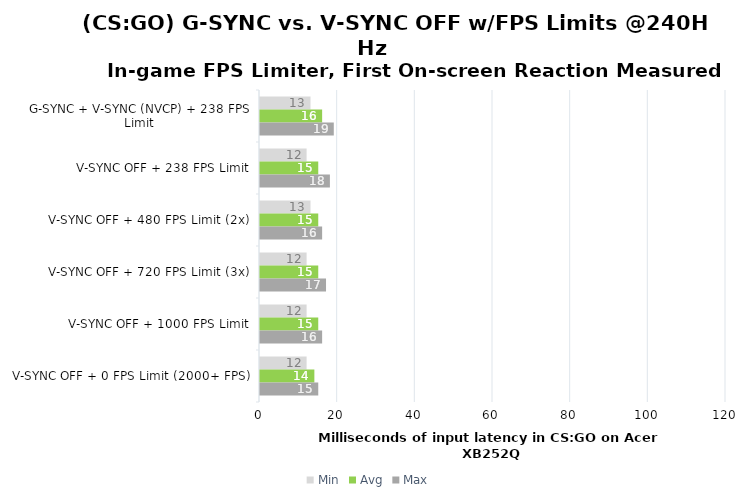
| Category | Min | Avg | Max |
|---|---|---|---|
| G-SYNC + V-SYNC (NVCP) + 238 FPS Limit | 13 | 16 | 19 |
| V-SYNC OFF + 238 FPS Limit | 12 | 15 | 18 |
| V-SYNC OFF + 480 FPS Limit (2x) | 13 | 15 | 16 |
| V-SYNC OFF + 720 FPS Limit (3x) | 12 | 15 | 17 |
| V-SYNC OFF + 1000 FPS Limit | 12 | 15 | 16 |
| V-SYNC OFF + 0 FPS Limit (2000+ FPS) | 12 | 14 | 15 |